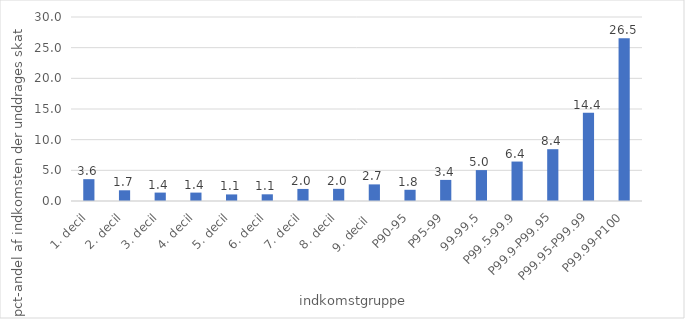
| Category | Series 0 |
|---|---|
| 1. decil | 3.56 |
| 2. decil | 1.746 |
| 3. decil | 1.372 |
| 4. decil | 1.37 |
| 5. decil | 1.072 |
| 6. decil | 1.091 |
| 7. decil | 1.966 |
| 8. decil | 1.983 |
| 9. decil  | 2.709 |
| P90-95 | 1.828 |
| P95-99 | 3.44 |
| 99-99,5 | 5.039 |
| P99.5-99.9 | 6.432 |
| P99.9-P99.95 | 8.446 |
| P99.95-P99.99 | 14.393 |
| P99.99-P100 | 26.54 |